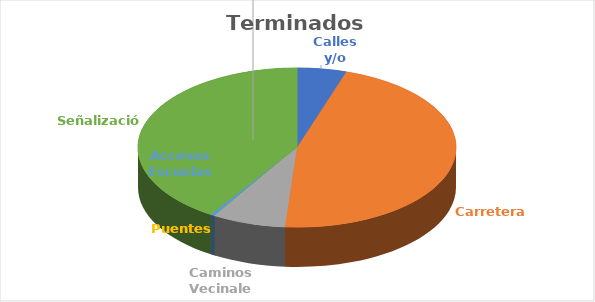
| Category | Terminados (kms) |
|---|---|
| Calles y/o Avenidas | 31.5 |
| Carreteras | 291.02 |
| Caminos Vecinales | 46.8 |
| Puentes  | 0.062 |
| Accesos Escuelas | 2.9 |
| Señalización | 257.67 |